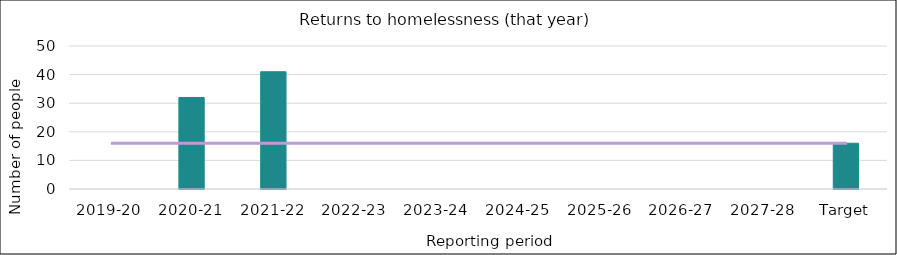
| Category | Series 0 |
|---|---|
| 2019-20 | 0 |
| 2020-21 | 32 |
| 2021-22 | 41 |
| 2022-23 | 0 |
| 2023-24 | 0 |
| 2024-25 | 0 |
| 2025-26 | 0 |
| 2026-27 | 0 |
| 2027-28 | 0 |
| Target | 16 |